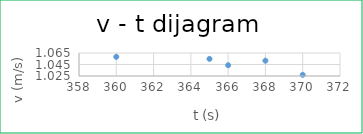
| Category | v (m/s) |
|---|---|
| 360.0 | 1.058 |
| 366.0 | 1.044 |
| 365.0 | 1.055 |
| 370.0 | 1.027 |
| 368.0 | 1.052 |